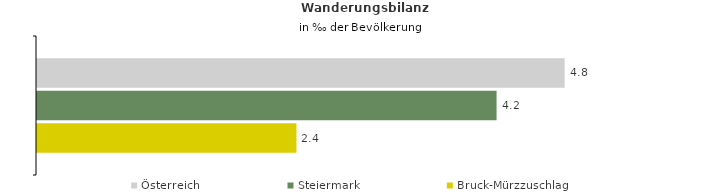
| Category | Österreich | Steiermark | Bruck-Mürzzuschlag |
|---|---|---|---|
| Wanderungsrate in ‰ der Bevölkerung, Periode 2017-2021 | 4.789 | 4.172 | 2.355 |